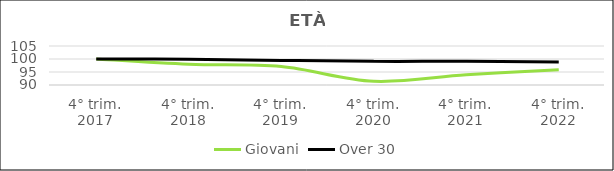
| Category | Giovani | Over 30 |
|---|---|---|
| 4° trim.
2017 | 100 | 100 |
| 4° trim.
2018 | 97.95 | 99.906 |
| 4° trim.
2019 | 97.077 | 99.448 |
| 4° trim.
2020 | 91.431 | 99.098 |
| 4° trim.
2021 | 93.918 | 99.092 |
| 4° trim.
2022 | 95.901 | 98.836 |